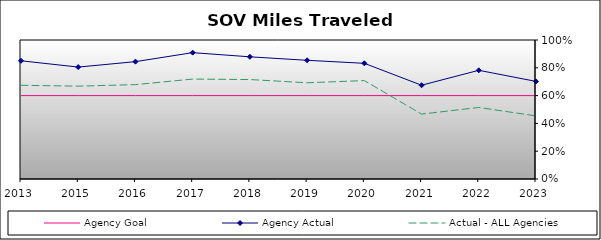
| Category | Agency Goal | Agency Actual | Actual - ALL Agencies |
|---|---|---|---|
| 2013.0 | 0.6 | 0.85 | 0.674 |
| 2015.0 | 0.6 | 0.805 | 0.668 |
| 2016.0 | 0.6 | 0.844 | 0.679 |
| 2017.0 | 0.6 | 0.909 | 0.719 |
| 2018.0 | 0.6 | 0.879 | 0.715 |
| 2019.0 | 0.6 | 0.854 | 0.692 |
| 2020.0 | 0.6 | 0.832 | 0.708 |
| 2021.0 | 0.6 | 0.675 | 0.467 |
| 2022.0 | 0.6 | 0.782 | 0.515 |
| 2023.0 | 0.6 | 0.702 | 0.454 |